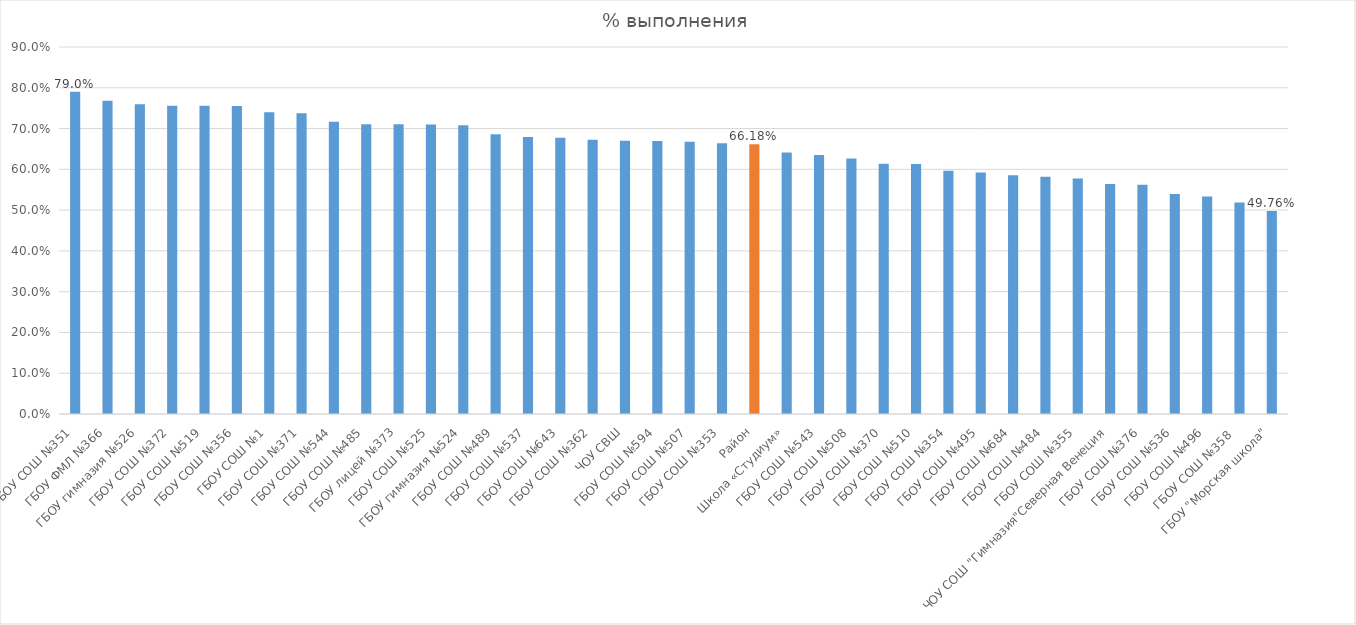
| Category | Series 0 |
|---|---|
| ГБОУ СОШ №351 | 0.79 |
| ГБОУ ФМЛ №366 | 0.768 |
| ГБОУ гимназия №526 | 0.759 |
| ГБОУ СОШ №372 | 0.756 |
| ГБОУ СОШ №519 | 0.756 |
| ГБОУ СОШ №356 | 0.755 |
| ГБОУ СОШ №1 | 0.74 |
| ГБОУ СОШ №371 | 0.737 |
| ГБОУ СОШ №544 | 0.717 |
| ГБОУ СОШ №485 | 0.711 |
| ГБОУ лицей №373 | 0.711 |
| ГБОУ СОШ №525 | 0.71 |
| ГБОУ гимназия №524 | 0.708 |
| ГБОУ СОШ №489 | 0.686 |
| ГБОУ СОШ №537 | 0.679 |
| ГБОУ СОШ №643 | 0.678 |
| ГБОУ СОШ №362 | 0.673 |
| ЧОУ СВШ | 0.67 |
| ГБОУ СОШ №594 | 0.669 |
| ГБОУ СОШ №507 | 0.668 |
| ГБОУ СОШ №353 | 0.664 |
| Район | 0.662 |
| Школа «Студиум» | 0.641 |
| ГБОУ СОШ №543 | 0.635 |
| ГБОУ СОШ №508 | 0.627 |
| ГБОУ СОШ №370 | 0.614 |
| ГБОУ СОШ №510 | 0.613 |
| ГБОУ СОШ №354 | 0.597 |
| ГБОУ СОШ №495 | 0.592 |
| ГБОУ СОШ №684 | 0.586 |
| ГБОУ СОШ №484 | 0.582 |
| ГБОУ СОШ №355 | 0.578 |
| ЧОУ СОШ "Гимназия"Северная Венеция | 0.564 |
| ГБОУ СОШ №376 | 0.562 |
| ГБОУ СОШ №536 | 0.539 |
| ГБОУ СОШ №496 | 0.534 |
| ГБОУ СОШ №358  | 0.519 |
| ГБОУ "Морская школа" | 0.498 |